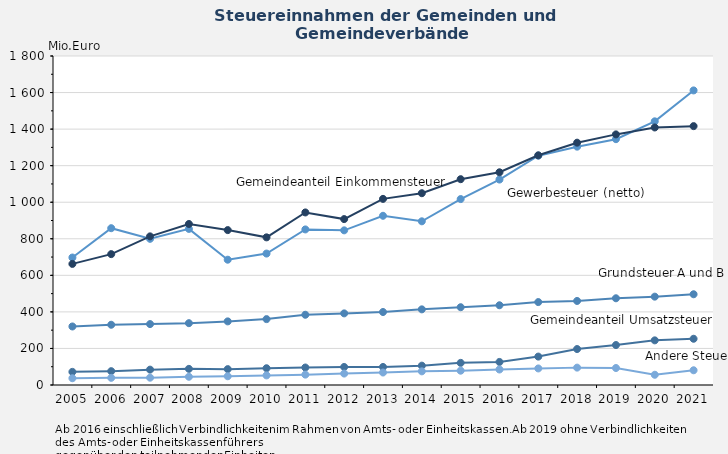
| Category | Grundsteuer A und B | Gewerbesteuer (netto) | Gemeindeanteil 
Einkommensteuer | Gemeindeanteil 
Umsatzsteuer | Andere Steuern |
|---|---|---|---|---|---|
| 2005-12-31 | 320.208 | 697.421 | 662.526 | 71.813 | 37.033 |
| 2006-12-31 | 329.619 | 857.879 | 715.979 | 75.637 | 39.19 |
| 2007-12-31 | 333.269 | 799.759 | 813.207 | 84.102 | 40.034 |
| 2008-12-31 | 338.242 | 854.057 | 880.961 | 88.295 | 45.037 |
| 2009-12-31 | 348.079 | 685.503 | 847.509 | 86.836 | 47.799 |
| 2010-12-31 | 360.489 | 719.131 | 807.797 | 91.705 | 52.512 |
| 2011-12-31 | 384.23 | 851.167 | 944.076 | 95.663 | 56.741 |
| 2012-12-31 | 391.824 | 846.148 | 907.703 | 98.665 | 62.563 |
| 2013-12-31 | 399.274 | 925.865 | 1018.347 | 98.632 | 68.281 |
| 2014-12-31 | 413.857 | 895.581 | 1049.296 | 105.843 | 74.697 |
| 2015-12-31 | 425.536 | 1017.273 | 1126.026 | 121.068 | 78.294 |
| 2016-12-31 | 436.281 | 1124.058 | 1163.786 | 126.118 | 84.757 |
| 2017-12-31 | 453.692 | 1254.583 | 1256.699 | 155.433 | 90.615 |
| 2018-12-31 | 459.815 | 1303.932 | 1325.789 | 196.757 | 95.06 |
| 2019-12-31 | 474.449 | 1344.946 | 1371.082 | 218.59 | 92.893 |
| 2020-12-31 | 483.363 | 1442.559 | 1408.991 | 244.286 | 56.023 |
| 2021-12-31 | 496.484 | 1611.718 | 1416.308 | 252.911 | 80.623 |